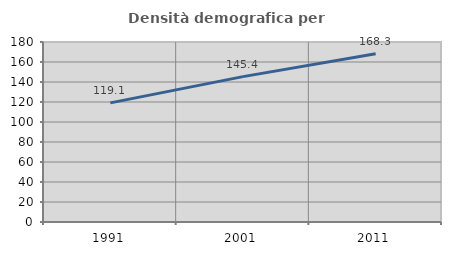
| Category | Densità demografica |
|---|---|
| 1991.0 | 119.102 |
| 2001.0 | 145.366 |
| 2011.0 | 168.315 |